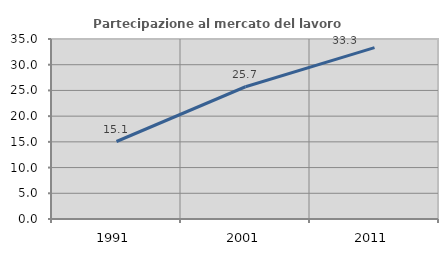
| Category | Partecipazione al mercato del lavoro  femminile |
|---|---|
| 1991.0 | 15.068 |
| 2001.0 | 25.714 |
| 2011.0 | 33.333 |